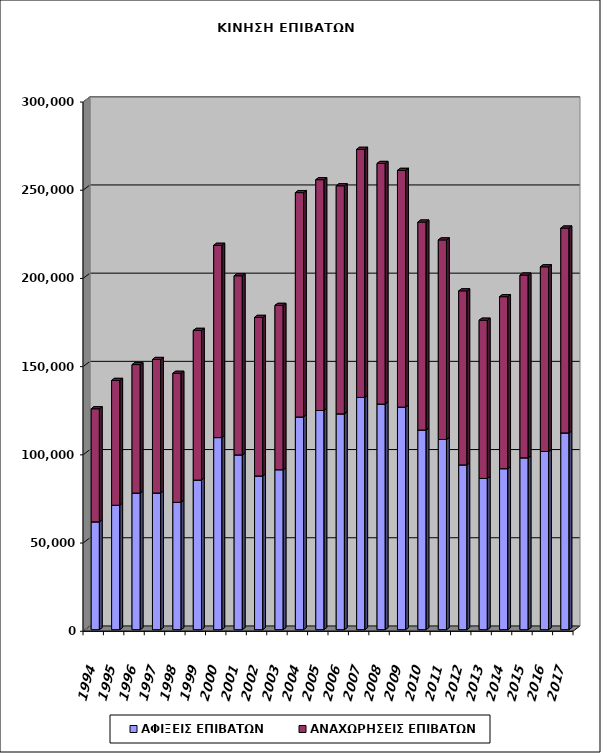
| Category | ΑΦΙΞΕΙΣ ΕΠΙΒΑΤΩΝ | ΑΝΑΧΩΡΗΣΕΙΣ ΕΠΙΒΑΤΩΝ |
|---|---|---|
| 1994.0 | 61128 | 64087 |
| 1995.0 | 70528 | 70755 |
| 1996.0 | 77442 | 72829 |
| 1997.0 | 77465 | 75686 |
| 1998.0 | 72191 | 73121 |
| 1999.0 | 84803 | 84847 |
| 2000.0 | 108894 | 108982 |
| 2001.0 | 99072 | 101542 |
| 2002.0 | 87132 | 89871 |
| 2003.0 | 90670 | 93151 |
| 2004.0 | 120578 | 127180 |
| 2005.0 | 124263 | 130814 |
| 2006.0 | 122334 | 129276 |
| 2007.0 | 131670 | 140601 |
| 2008.0 | 127889 | 136387 |
| 2009.0 | 126171 | 134176 |
| 2010.0 | 113168 | 117889 |
| 2011.0 | 107819 | 113102 |
| 2012.0 | 93412 | 98631 |
| 2013.0 | 85723 | 89699 |
| 2014.0 | 91265 | 97485 |
| 2015.0 | 97411 | 103589 |
| 2016.0 | 101025 | 104670 |
| 2017.0 | 111524 | 116127 |